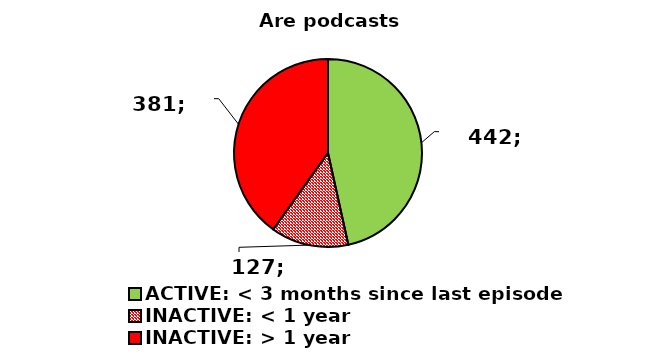
| Category | Series 0 |
|---|---|
| ACTIVE: < 3 months since last episode | 442 |
| INACTIVE: < 1 year | 127 |
| INACTIVE: > 1 year | 381 |